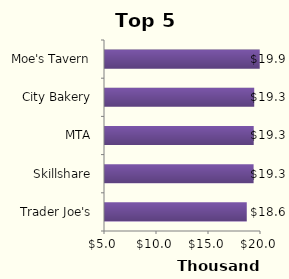
| Category | Total |
|---|---|
| Trader Joe's | 18631.779 |
| Skillshare | 19288.295 |
| MTA | 19300.271 |
| City Bakery | 19348.176 |
| Moe's Tavern | 19877.309 |